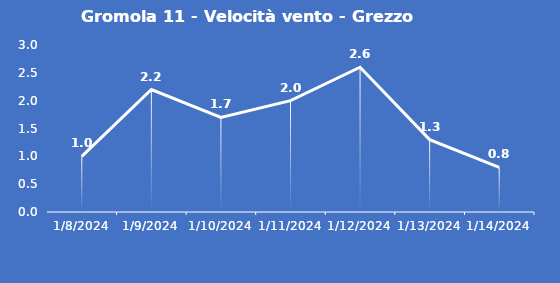
| Category | Gromola 11 - Velocità vento - Grezzo (m/s) |
|---|---|
| 1/8/24 | 1 |
| 1/9/24 | 2.2 |
| 1/10/24 | 1.7 |
| 1/11/24 | 2 |
| 1/12/24 | 2.6 |
| 1/13/24 | 1.3 |
| 1/14/24 | 0.8 |